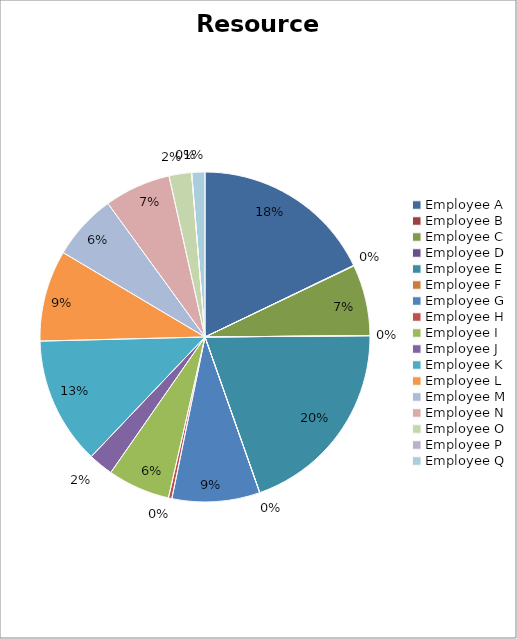
| Category | data |
|---|---|
| Employee A | 23670 |
| Employee B | 75 |
| Employee C | 9225 |
| Employee D | 0 |
| Employee E | 26175 |
| Employee F | 0 |
| Employee G | 11400 |
| Employee H | 450 |
| Employee I | 8100 |
| Employee J | 3225 |
| Employee K | 16575 |
| Employee L | 11850 |
| Employee M | 8550 |
| Employee N | 8625 |
| Employee O | 2925 |
| Employee P | 0 |
| Employee Q | 1725 |